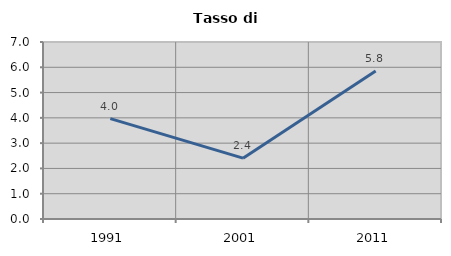
| Category | Tasso di disoccupazione   |
|---|---|
| 1991.0 | 3.971 |
| 2001.0 | 2.406 |
| 2011.0 | 5.85 |